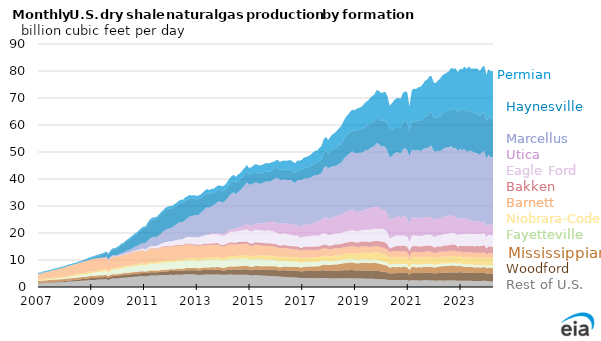
| Category | Rest of U.S. | Woodford | Mississippian | Fayetteville | Niobrara-Codell | Barnett | Bakken | Eagle Ford | Utica | Marcellus | Haynesville | Permian |
|---|---|---|---|---|---|---|---|---|---|---|---|---|
| 2007-01-01 | 1.405 | 0.129 | 0.777 | 0.099 | 0.393 | 1.977 | 0.047 | 0 | 0.001 | 0.002 | 0.082 | 0.333 |
| 2007-02-01 | 1.277 | 0.146 | 0.771 | 0.115 | 0.404 | 2.049 | 0.048 | 0 | 0.001 | 0.002 | 0.081 | 0.348 |
| 2007-03-01 | 1.475 | 0.165 | 0.792 | 0.139 | 0.466 | 2.178 | 0.048 | 0 | 0.001 | 0.003 | 0.08 | 0.356 |
| 2007-04-01 | 1.463 | 0.176 | 0.789 | 0.157 | 0.479 | 2.267 | 0.051 | 0 | 0.001 | 0.003 | 0.076 | 0.356 |
| 2007-05-01 | 1.531 | 0.176 | 0.803 | 0.171 | 0.483 | 2.394 | 0.054 | 0 | 0.001 | 0.004 | 0.079 | 0.358 |
| 2007-06-01 | 1.569 | 0.19 | 0.811 | 0.193 | 0.47 | 2.483 | 0.055 | 0 | 0.001 | 0.004 | 0.077 | 0.363 |
| 2007-07-01 | 1.619 | 0.211 | 0.809 | 0.226 | 0.476 | 2.591 | 0.056 | 0 | 0.001 | 0.005 | 0.077 | 0.371 |
| 2007-08-01 | 1.667 | 0.233 | 0.804 | 0.261 | 0.491 | 2.781 | 0.057 | 0 | 0.001 | 0.006 | 0.077 | 0.379 |
| 2007-09-01 | 1.679 | 0.258 | 0.81 | 0.289 | 0.489 | 2.847 | 0.056 | 0 | 0.001 | 0.007 | 0.079 | 0.379 |
| 2007-10-01 | 1.726 | 0.286 | 0.794 | 0.33 | 0.481 | 2.952 | 0.061 | 0 | 0.001 | 0.008 | 0.079 | 0.376 |
| 2007-11-01 | 1.792 | 0.298 | 0.797 | 0.378 | 0.497 | 3.086 | 0.059 | 0 | 0.001 | 0.009 | 0.084 | 0.375 |
| 2007-12-01 | 1.807 | 0.325 | 0.771 | 0.407 | 0.476 | 3.181 | 0.061 | 0 | 0.001 | 0.011 | 0.086 | 0.369 |
| 2008-01-01 | 1.836 | 0.347 | 0.774 | 0.438 | 0.459 | 3.357 | 0.053 | 0 | 0.001 | 0.015 | 0.088 | 0.37 |
| 2008-02-01 | 1.898 | 0.366 | 0.796 | 0.496 | 0.487 | 3.46 | 0.052 | 0 | 0.001 | 0.018 | 0.084 | 0.381 |
| 2008-03-01 | 1.987 | 0.397 | 0.776 | 0.567 | 0.51 | 3.525 | 0.054 | 0 | 0.001 | 0.02 | 0.086 | 0.388 |
| 2008-04-01 | 2.012 | 0.438 | 0.786 | 0.601 | 0.524 | 3.591 | 0.058 | 0.001 | 0.001 | 0.021 | 0.102 | 0.385 |
| 2008-05-01 | 2.054 | 0.481 | 0.776 | 0.636 | 0.531 | 3.733 | 0.062 | 0.001 | 0.001 | 0.023 | 0.106 | 0.399 |
| 2008-06-01 | 2.122 | 0.519 | 0.772 | 0.685 | 0.536 | 3.767 | 0.063 | 0.001 | 0.001 | 0.026 | 0.108 | 0.392 |
| 2008-07-01 | 2.188 | 0.563 | 0.756 | 0.739 | 0.533 | 3.865 | 0.065 | 0 | 0.001 | 0.027 | 0.122 | 0.415 |
| 2008-08-01 | 2.253 | 0.585 | 0.749 | 0.794 | 0.545 | 4.001 | 0.068 | 0 | 0.001 | 0.028 | 0.132 | 0.419 |
| 2008-09-01 | 2.34 | 0.622 | 0.735 | 0.877 | 0.55 | 4.046 | 0.069 | 0.001 | 0.001 | 0.031 | 0.16 | 0.34 |
| 2008-10-01 | 2.36 | 0.637 | 0.695 | 0.905 | 0.544 | 4.197 | 0.077 | 0.004 | 0.001 | 0.044 | 0.211 | 0.397 |
| 2008-11-01 | 2.397 | 0.681 | 0.713 | 0.956 | 0.56 | 4.267 | 0.08 | 0.005 | 0.001 | 0.061 | 0.267 | 0.429 |
| 2008-12-01 | 2.474 | 0.73 | 0.763 | 1.039 | 0.533 | 4.297 | 0.066 | 0.004 | 0.001 | 0.074 | 0.367 | 0.434 |
| 2009-01-01 | 2.55 | 0.769 | 0.761 | 1.114 | 0.538 | 4.332 | 0.072 | 0.005 | 0.001 | 0.079 | 0.415 | 0.436 |
| 2009-02-01 | 2.592 | 0.803 | 0.766 | 1.135 | 0.556 | 4.43 | 0.075 | 0.008 | 0.001 | 0.099 | 0.497 | 0.445 |
| 2009-03-01 | 2.602 | 0.828 | 0.722 | 1.2 | 0.566 | 4.453 | 0.079 | 0.01 | 0.001 | 0.109 | 0.596 | 0.454 |
| 2009-04-01 | 2.708 | 0.836 | 0.716 | 1.287 | 0.543 | 4.41 | 0.084 | 0.012 | 0.001 | 0.135 | 0.75 | 0.452 |
| 2009-05-01 | 2.766 | 0.834 | 0.73 | 1.349 | 0.553 | 4.328 | 0.086 | 0.018 | 0.001 | 0.147 | 0.892 | 0.464 |
| 2009-06-01 | 2.804 | 0.851 | 0.735 | 1.424 | 0.546 | 4.267 | 0.088 | 0.022 | 0.001 | 0.168 | 1.056 | 0.46 |
| 2009-07-01 | 2.776 | 0.872 | 0.727 | 1.39 | 0.542 | 4.219 | 0.093 | 0.031 | 0.001 | 0.366 | 1.192 | 0.452 |
| 2009-08-01 | 2.973 | 0.841 | 0.721 | 1.597 | 0.549 | 4.151 | 0.096 | 0.04 | 0.001 | 0.366 | 1.398 | 0.456 |
| 2009-09-01 | 2.532 | 0.83 | 0.677 | 1.142 | 0.547 | 4.091 | 0.098 | 0.051 | 0.001 | 0.368 | 1.591 | 0.466 |
| 2009-10-01 | 2.964 | 0.877 | 0.688 | 1.589 | 0.53 | 4.117 | 0.095 | 0.073 | 0.001 | 0.368 | 1.864 | 0.471 |
| 2009-11-01 | 3.149 | 0.906 | 0.694 | 1.777 | 0.538 | 4.102 | 0.098 | 0.106 | 0.001 | 0.376 | 2.131 | 0.478 |
| 2009-12-01 | 3.146 | 0.931 | 0.661 | 1.817 | 0.526 | 4.084 | 0.096 | 0.105 | 0.001 | 0.382 | 2.184 | 0.467 |
| 2010-01-01 | 3.133 | 0.966 | 0.651 | 1.812 | 0.543 | 4.125 | 0.107 | 0.115 | 0.001 | 0.438 | 2.444 | 0.474 |
| 2010-02-01 | 3.226 | 1.013 | 0.658 | 1.839 | 0.551 | 4.161 | 0.114 | 0.123 | 0.001 | 0.522 | 2.657 | 0.496 |
| 2010-03-01 | 3.37 | 1.018 | 0.635 | 1.896 | 0.554 | 4.255 | 0.121 | 0.135 | 0.001 | 0.612 | 3.025 | 0.501 |
| 2010-04-01 | 3.457 | 1.023 | 0.65 | 2 | 0.564 | 4.101 | 0.127 | 0.151 | 0.001 | 0.724 | 3.119 | 0.513 |
| 2010-05-01 | 3.472 | 1.136 | 0.646 | 2.029 | 0.571 | 4.356 | 0.136 | 0.185 | 0.001 | 0.868 | 3.332 | 0.54 |
| 2010-06-01 | 3.523 | 1.086 | 0.655 | 2.072 | 0.561 | 4.327 | 0.143 | 0.226 | 0.001 | 0.962 | 3.679 | 0.546 |
| 2010-07-01 | 3.648 | 1.09 | 0.671 | 2.142 | 0.523 | 4.442 | 0.151 | 0.238 | 0.001 | 1.055 | 3.957 | 0.563 |
| 2010-08-01 | 3.721 | 1.06 | 0.648 | 2.23 | 0.575 | 4.496 | 0.155 | 0.269 | 0.001 | 1.189 | 4.183 | 0.569 |
| 2010-09-01 | 3.784 | 1.091 | 0.651 | 2.261 | 0.577 | 4.646 | 0.167 | 0.309 | 0.001 | 1.357 | 4.384 | 0.573 |
| 2010-10-01 | 3.811 | 1.109 | 0.654 | 2.286 | 0.575 | 4.651 | 0.167 | 0.347 | 0.001 | 1.561 | 4.462 | 0.591 |
| 2010-11-01 | 3.936 | 1.132 | 0.674 | 2.32 | 0.583 | 4.709 | 0.181 | 0.387 | 0.001 | 1.73 | 4.839 | 0.603 |
| 2010-12-01 | 3.96 | 1.202 | 0.647 | 2.382 | 0.588 | 4.731 | 0.173 | 0.506 | 0.001 | 1.871 | 5.179 | 0.607 |
| 2011-01-01 | 3.937 | 1.242 | 0.61 | 2.375 | 0.571 | 4.704 | 0.152 | 0.568 | 0 | 2.158 | 5.446 | 0.619 |
| 2011-02-01 | 3.941 | 1.198 | 0.593 | 2.35 | 0.566 | 4.428 | 0.154 | 0.607 | 0 | 2.439 | 5.634 | 0.559 |
| 2011-03-01 | 4.074 | 1.176 | 0.64 | 2.418 | 0.597 | 4.851 | 0.164 | 0.625 | 0 | 2.724 | 6.122 | 0.661 |
| 2011-04-01 | 4.242 | 1.26 | 0.635 | 2.535 | 0.604 | 4.912 | 0.165 | 0.734 | 0 | 2.962 | 6.388 | 0.674 |
| 2011-05-01 | 4.263 | 1.209 | 0.638 | 2.538 | 0.589 | 4.975 | 0.169 | 0.79 | 0 | 3.194 | 6.603 | 0.706 |
| 2011-06-01 | 4.261 | 1.171 | 0.627 | 2.542 | 0.615 | 4.907 | 0.185 | 0.833 | 0.008 | 3.425 | 6.522 | 0.734 |
| 2011-07-01 | 4.269 | 1.171 | 0.651 | 2.573 | 0.62 | 4.889 | 0.206 | 0.922 | 0.009 | 3.222 | 6.688 | 0.775 |
| 2011-08-01 | 4.293 | 1.221 | 0.637 | 2.572 | 0.634 | 4.934 | 0.224 | 1.043 | 0.012 | 3.518 | 6.952 | 0.789 |
| 2011-09-01 | 4.414 | 1.229 | 0.64 | 2.669 | 0.625 | 5.061 | 0.233 | 1.186 | 0.018 | 3.82 | 7.095 | 0.802 |
| 2011-10-01 | 4.427 | 1.239 | 0.664 | 2.704 | 0.647 | 5.1 | 0.248 | 1.261 | 0.019 | 4.211 | 7.149 | 0.823 |
| 2011-11-01 | 4.459 | 1.305 | 0.648 | 2.69 | 0.659 | 5.193 | 0.261 | 1.404 | 0.019 | 4.557 | 7.342 | 0.847 |
| 2011-12-01 | 4.46 | 1.322 | 0.664 | 2.711 | 0.655 | 5.115 | 0.272 | 1.512 | 0.019 | 4.854 | 7.281 | 0.849 |
| 2012-01-01 | 4.497 | 1.423 | 0.67 | 2.73 | 0.662 | 5.055 | 0.283 | 1.613 | 0.013 | 4.795 | 7.389 | 0.885 |
| 2012-02-01 | 4.503 | 1.385 | 0.654 | 2.706 | 0.682 | 5.003 | 0.295 | 1.654 | 0.017 | 5.152 | 6.998 | 0.932 |
| 2012-03-01 | 4.435 | 1.459 | 0.651 | 2.743 | 0.704 | 5.142 | 0.309 | 1.74 | 0.018 | 5.509 | 6.956 | 0.978 |
| 2012-04-01 | 4.591 | 1.435 | 0.701 | 2.778 | 0.636 | 5.09 | 0.323 | 1.767 | 0.022 | 5.887 | 6.914 | 1.028 |
| 2012-05-01 | 4.559 | 1.513 | 0.718 | 2.756 | 0.704 | 5.095 | 0.344 | 1.907 | 0.022 | 6.264 | 6.984 | 1.037 |
| 2012-06-01 | 4.557 | 1.464 | 0.734 | 2.758 | 0.649 | 5.042 | 0.357 | 1.998 | 0.035 | 6.47 | 7.184 | 1.068 |
| 2012-07-01 | 4.579 | 1.381 | 0.755 | 2.754 | 0.651 | 5.151 | 0.37 | 2.091 | 0.044 | 6.3 | 7.144 | 1.137 |
| 2012-08-01 | 4.702 | 1.468 | 0.796 | 2.839 | 0.655 | 5.114 | 0.395 | 2.238 | 0.054 | 6.635 | 7.135 | 1.153 |
| 2012-09-01 | 4.679 | 1.567 | 0.799 | 2.868 | 0.714 | 5.098 | 0.414 | 2.334 | 0.062 | 6.932 | 6.969 | 1.194 |
| 2012-10-01 | 4.748 | 1.466 | 0.8 | 2.877 | 0.768 | 5.034 | 0.416 | 2.462 | 0.062 | 7.511 | 6.726 | 1.235 |
| 2012-11-01 | 4.717 | 1.447 | 0.851 | 2.899 | 0.779 | 4.674 | 0.408 | 2.556 | 0.074 | 7.78 | 6.406 | 1.275 |
| 2012-12-01 | 4.648 | 1.569 | 0.831 | 2.888 | 0.782 | 4.74 | 0.429 | 2.565 | 0.086 | 8.055 | 6.191 | 1.264 |
| 2013-01-01 | 4.561 | 1.643 | 0.873 | 2.833 | 0.765 | 4.764 | 0.423 | 2.594 | 0.084 | 8.008 | 5.941 | 1.248 |
| 2013-02-01 | 4.488 | 1.569 | 0.83 | 2.767 | 0.786 | 4.748 | 0.449 | 2.744 | 0.104 | 8.222 | 5.815 | 1.321 |
| 2013-03-01 | 4.484 | 1.65 | 0.846 | 2.749 | 0.794 | 4.73 | 0.455 | 2.898 | 0.114 | 8.684 | 5.553 | 1.349 |
| 2013-04-01 | 4.539 | 1.708 | 0.923 | 2.78 | 0.803 | 4.654 | 0.463 | 2.976 | 0.154 | 9.112 | 5.441 | 1.457 |
| 2013-05-01 | 4.602 | 1.704 | 0.954 | 2.816 | 0.795 | 4.666 | 0.485 | 3.096 | 0.168 | 9.712 | 5.308 | 1.5 |
| 2013-06-01 | 4.61 | 1.655 | 0.937 | 2.82 | 0.788 | 4.65 | 0.506 | 3.243 | 0.209 | 10.145 | 5.158 | 1.558 |
| 2013-07-01 | 4.577 | 1.69 | 0.956 | 2.807 | 0.809 | 4.648 | 0.535 | 3.288 | 0.34 | 9.7 | 4.968 | 1.595 |
| 2013-08-01 | 4.627 | 1.743 | 1.014 | 2.834 | 0.842 | 4.66 | 0.553 | 3.275 | 0.384 | 10.081 | 4.744 | 1.633 |
| 2013-09-01 | 4.623 | 1.721 | 0.912 | 2.833 | 0.814 | 4.615 | 0.583 | 3.339 | 0.422 | 10.438 | 4.43 | 1.708 |
| 2013-10-01 | 4.665 | 1.728 | 0.985 | 2.867 | 0.874 | 4.604 | 0.582 | 3.293 | 0.431 | 11.009 | 4.298 | 1.722 |
| 2013-11-01 | 4.669 | 1.698 | 1.006 | 2.866 | 0.891 | 4.536 | 0.596 | 3.275 | 0.472 | 11.683 | 4.293 | 1.676 |
| 2013-12-01 | 4.578 | 1.701 | 0.961 | 2.79 | 0.839 | 4.236 | 0.559 | 3.464 | 0.546 | 11.968 | 4.228 | 1.67 |
| 2014-01-01 | 4.526 | 1.592 | 0.986 | 2.77 | 0.835 | 4.344 | 0.582 | 3.387 | 0.682 | 11.583 | 4.141 | 1.807 |
| 2014-02-01 | 4.537 | 1.601 | 0.972 | 2.805 | 0.869 | 4.329 | 0.608 | 3.478 | 0.711 | 11.893 | 4.101 | 1.873 |
| 2014-03-01 | 4.569 | 1.729 | 1.054 | 2.82 | 0.927 | 4.376 | 0.623 | 3.603 | 0.778 | 12.225 | 4.091 | 1.996 |
| 2014-04-01 | 4.631 | 1.881 | 1.115 | 2.822 | 0.98 | 4.411 | 0.639 | 3.795 | 0.858 | 12.652 | 4.137 | 2.117 |
| 2014-05-01 | 4.629 | 1.878 | 1.118 | 2.831 | 1.032 | 4.381 | 0.679 | 3.943 | 0.908 | 13.177 | 4.226 | 2.183 |
| 2014-06-01 | 4.548 | 1.894 | 1.127 | 2.777 | 1.038 | 4.327 | 0.715 | 4.054 | 1.014 | 13.617 | 4.168 | 2.252 |
| 2014-07-01 | 4.563 | 1.882 | 1.159 | 2.791 | 1.048 | 4.254 | 0.744 | 4.094 | 1.251 | 12.594 | 4.08 | 2.33 |
| 2014-08-01 | 4.565 | 1.916 | 1.202 | 2.793 | 1.146 | 4.239 | 0.774 | 4.137 | 1.386 | 12.979 | 4.084 | 2.443 |
| 2014-09-01 | 4.56 | 1.929 | 1.229 | 2.782 | 1.129 | 4.224 | 0.818 | 4.151 | 1.519 | 13.517 | 4.029 | 2.348 |
| 2014-10-01 | 4.553 | 1.942 | 1.268 | 2.763 | 1.185 | 4.208 | 0.823 | 4.232 | 1.668 | 14.086 | 3.982 | 2.487 |
| 2014-11-01 | 4.59 | 2.014 | 1.281 | 2.806 | 1.168 | 4.153 | 0.825 | 4.332 | 1.773 | 14.755 | 3.879 | 2.531 |
| 2014-12-01 | 4.555 | 1.988 | 1.298 | 2.746 | 1.23 | 4.171 | 0.87 | 4.623 | 1.919 | 15.352 | 3.903 | 2.569 |
| 2015-01-01 | 4.394 | 1.972 | 1.288 | 2.638 | 1.237 | 3.917 | 0.89 | 4.46 | 2.031 | 15.088 | 3.859 | 2.295 |
| 2015-02-01 | 4.226 | 1.958 | 1.324 | 2.528 | 1.306 | 3.862 | 0.895 | 4.569 | 2.132 | 15.123 | 3.922 | 2.501 |
| 2015-03-01 | 4.365 | 2.034 | 1.153 | 2.606 | 1.349 | 3.813 | 0.924 | 4.6 | 2.16 | 15.358 | 3.951 | 2.655 |
| 2015-04-01 | 4.422 | 2.109 | 1.363 | 2.647 | 1.397 | 3.814 | 0.929 | 4.579 | 2.336 | 15.162 | 3.911 | 2.855 |
| 2015-05-01 | 4.386 | 2.02 | 1.37 | 2.626 | 1.403 | 3.738 | 0.981 | 4.565 | 2.533 | 14.746 | 3.892 | 2.97 |
| 2015-06-01 | 4.287 | 2.045 | 1.361 | 2.543 | 1.464 | 3.686 | 1.003 | 4.563 | 2.643 | 14.571 | 3.779 | 3.029 |
| 2015-07-01 | 4.225 | 2.156 | 1.346 | 2.494 | 1.421 | 3.644 | 1.01 | 4.656 | 2.661 | 14.876 | 3.774 | 2.983 |
| 2015-08-01 | 4.161 | 2.158 | 1.368 | 2.443 | 1.517 | 3.604 | 1.001 | 4.594 | 2.81 | 15.213 | 3.721 | 3.114 |
| 2015-09-01 | 4.147 | 2.177 | 1.361 | 2.445 | 1.516 | 3.567 | 0.978 | 4.714 | 2.913 | 15.303 | 3.661 | 3.146 |
| 2015-10-01 | 4.111 | 2.255 | 1.385 | 2.405 | 1.552 | 3.532 | 1.012 | 4.697 | 3.176 | 14.911 | 3.627 | 3.108 |
| 2015-11-01 | 4.097 | 2.259 | 1.34 | 2.365 | 1.554 | 3.5 | 1.026 | 4.566 | 3.404 | 15.133 | 3.725 | 3.129 |
| 2015-12-01 | 4.072 | 2.353 | 1.304 | 2.324 | 1.534 | 3.45 | 1.023 | 4.615 | 3.543 | 15.586 | 3.651 | 2.851 |
| 2016-01-01 | 3.962 | 2.427 | 1.332 | 2.243 | 1.584 | 3.294 | 1.075 | 4.363 | 3.663 | 16.264 | 3.733 | 2.843 |
| 2016-02-01 | 3.927 | 2.225 | 1.311 | 2.214 | 1.593 | 3.308 | 1.11 | 4.303 | 3.819 | 16.64 | 3.712 | 3.026 |
| 2016-03-01 | 3.85 | 2.185 | 1.221 | 2.148 | 1.585 | 3.26 | 1.125 | 4.265 | 3.901 | 16.183 | 3.496 | 3.138 |
| 2016-04-01 | 3.792 | 2.417 | 1.237 | 2.109 | 1.635 | 3.206 | 1.067 | 4.272 | 3.765 | 16.165 | 3.733 | 3.226 |
| 2016-05-01 | 3.745 | 2.504 | 1.353 | 2.066 | 1.655 | 3.201 | 1.078 | 4.285 | 3.82 | 16.115 | 3.758 | 3.283 |
| 2016-06-01 | 3.683 | 2.464 | 1.4 | 1.996 | 1.594 | 3.136 | 1.088 | 4.264 | 3.92 | 16.061 | 3.737 | 3.366 |
| 2016-07-01 | 3.637 | 2.516 | 1.367 | 1.954 | 1.602 | 3.099 | 1.11 | 4.176 | 3.851 | 16.297 | 3.831 | 3.468 |
| 2016-08-01 | 3.626 | 2.528 | 1.38 | 1.918 | 1.65 | 3.059 | 1.069 | 4.078 | 4.114 | 16.276 | 3.725 | 3.579 |
| 2016-09-01 | 3.573 | 2.487 | 1.392 | 1.894 | 1.635 | 3.007 | 1.052 | 3.967 | 4.196 | 15.835 | 3.732 | 3.601 |
| 2016-10-01 | 3.518 | 2.467 | 1.442 | 1.88 | 1.673 | 2.99 | 1.124 | 3.926 | 3.961 | 15.487 | 3.704 | 3.653 |
| 2016-11-01 | 3.465 | 2.494 | 1.485 | 1.864 | 1.688 | 2.955 | 1.154 | 3.866 | 4.073 | 16.5 | 3.704 | 3.609 |
| 2016-12-01 | 3.359 | 2.487 | 1.461 | 1.805 | 1.65 | 2.888 | 1.007 | 3.756 | 4.241 | 16.865 | 3.697 | 3.532 |
| 2017-01-01 | 3.292 | 2.463 | 1.442 | 1.762 | 1.634 | 2.881 | 1.022 | 3.767 | 4.283 | 17.105 | 3.781 | 3.672 |
| 2017-02-01 | 3.32 | 2.598 | 1.566 | 1.773 | 1.652 | 2.911 | 1.122 | 3.798 | 4.351 | 17.074 | 3.853 | 3.918 |
| 2017-03-01 | 3.279 | 2.621 | 1.573 | 1.734 | 1.666 | 2.867 | 1.136 | 3.745 | 4.408 | 17.119 | 3.991 | 4.023 |
| 2017-04-01 | 3.29 | 2.622 | 1.634 | 1.725 | 1.661 | 2.859 | 1.207 | 3.806 | 4.356 | 17.196 | 4.003 | 4.105 |
| 2017-05-01 | 3.291 | 2.626 | 1.633 | 1.706 | 1.627 | 2.824 | 1.215 | 3.881 | 4.439 | 17.255 | 4.144 | 4.33 |
| 2017-06-01 | 3.289 | 2.622 | 1.717 | 1.68 | 1.643 | 2.805 | 1.213 | 3.993 | 4.712 | 17.3 | 4.345 | 4.423 |
| 2017-07-01 | 3.238 | 2.637 | 1.738 | 1.637 | 1.683 | 2.767 | 1.246 | 4.122 | 5.041 | 17.305 | 4.393 | 4.584 |
| 2017-08-01 | 3.255 | 2.632 | 1.839 | 1.625 | 1.742 | 2.726 | 1.28 | 3.852 | 5.223 | 17.196 | 4.592 | 4.62 |
| 2017-09-01 | 3.349 | 2.617 | 1.755 | 1.598 | 1.766 | 2.701 | 1.276 | 3.995 | 5.383 | 17.363 | 4.929 | 4.733 |
| 2017-10-01 | 3.322 | 2.883 | 1.864 | 1.581 | 1.749 | 2.699 | 1.358 | 4.156 | 5.375 | 17.099 | 5.132 | 5.045 |
| 2017-11-01 | 3.346 | 2.887 | 2.018 | 1.566 | 1.797 | 2.682 | 1.381 | 4.228 | 5.724 | 18.478 | 5.505 | 5.17 |
| 2017-12-01 | 3.314 | 2.82 | 2.111 | 1.525 | 1.866 | 2.699 | 1.376 | 4.163 | 6.004 | 18.953 | 5.601 | 5.194 |
| 2018-01-01 | 3.203 | 2.755 | 2.197 | 1.414 | 1.855 | 2.542 | 1.333 | 3.95 | 6.035 | 18.584 | 5.581 | 4.969 |
| 2018-02-01 | 3.18 | 2.767 | 2.224 | 1.411 | 1.841 | 2.588 | 1.356 | 3.952 | 6.243 | 18.864 | 5.882 | 5.362 |
| 2018-03-01 | 3.188 | 2.798 | 2.256 | 1.398 | 1.867 | 2.585 | 1.363 | 4.041 | 6.319 | 18.822 | 6.197 | 5.681 |
| 2018-04-01 | 3.224 | 2.868 | 2.302 | 1.463 | 1.964 | 2.565 | 1.445 | 4.024 | 6.103 | 18.817 | 6.386 | 5.939 |
| 2018-05-01 | 3.184 | 2.783 | 2.384 | 1.419 | 1.972 | 2.58 | 1.496 | 4.075 | 6.53 | 18.644 | 6.778 | 6.05 |
| 2018-06-01 | 3.216 | 2.845 | 2.466 | 1.4 | 1.856 | 2.572 | 1.484 | 4.12 | 6.743 | 18.87 | 6.951 | 6.288 |
| 2018-07-01 | 3.235 | 2.884 | 2.528 | 1.372 | 1.933 | 2.511 | 1.548 | 4.09 | 6.598 | 19.414 | 7.072 | 6.562 |
| 2018-08-01 | 3.286 | 2.88 | 2.613 | 1.377 | 2.024 | 2.504 | 1.573 | 4.148 | 6.96 | 19.893 | 7.244 | 6.9 |
| 2018-09-01 | 3.256 | 2.931 | 2.685 | 1.368 | 2.076 | 2.479 | 1.621 | 4.132 | 7.311 | 20.479 | 7.403 | 7.102 |
| 2018-10-01 | 3.243 | 2.934 | 2.827 | 1.367 | 2.094 | 2.48 | 1.652 | 4.113 | 7.316 | 20.868 | 7.69 | 7.23 |
| 2018-11-01 | 3.265 | 3 | 2.8 | 1.361 | 2.205 | 2.455 | 1.628 | 4.169 | 7.577 | 21.295 | 7.737 | 7.364 |
| 2018-12-01 | 3.21 | 3.052 | 2.815 | 1.343 | 2.264 | 2.451 | 1.712 | 4.215 | 7.797 | 21.413 | 7.741 | 7.681 |
| 2019-01-01 | 3.162 | 2.972 | 2.733 | 1.323 | 2.311 | 2.457 | 1.729 | 4.178 | 7.043 | 21.69 | 8.06 | 7.785 |
| 2019-02-01 | 3.137 | 2.979 | 2.677 | 1.3 | 2.307 | 2.441 | 1.671 | 4.131 | 7.262 | 21.701 | 8.383 | 8.034 |
| 2019-03-01 | 3.137 | 2.951 | 2.654 | 1.286 | 2.278 | 2.413 | 1.799 | 4.136 | 7.35 | 21.737 | 8.429 | 8.165 |
| 2019-04-01 | 3.156 | 2.988 | 2.832 | 1.28 | 2.386 | 2.391 | 1.817 | 4.232 | 6.903 | 21.733 | 8.563 | 8.401 |
| 2019-05-01 | 3.108 | 3.033 | 2.875 | 1.252 | 2.371 | 2.366 | 1.809 | 4.296 | 7.286 | 21.577 | 8.752 | 8.762 |
| 2019-06-01 | 3.094 | 3.01 | 2.895 | 1.24 | 2.445 | 2.344 | 1.855 | 4.357 | 7.56 | 21.847 | 8.855 | 8.912 |
| 2019-07-01 | 3.046 | 2.957 | 2.96 | 1.228 | 2.412 | 2.319 | 1.893 | 4.405 | 7.473 | 22.035 | 9.13 | 9.13 |
| 2019-08-01 | 3.017 | 2.863 | 2.906 | 1.218 | 2.455 | 2.299 | 1.939 | 4.463 | 7.939 | 22.14 | 9.08 | 9.558 |
| 2019-09-01 | 3.039 | 3.028 | 2.968 | 1.207 | 2.463 | 2.28 | 1.9 | 4.529 | 8.224 | 22.259 | 9.071 | 9.804 |
| 2019-10-01 | 2.987 | 3.02 | 2.926 | 1.203 | 2.674 | 2.259 | 1.99 | 4.524 | 7.892 | 22.663 | 9.231 | 9.868 |
| 2019-11-01 | 2.985 | 3.035 | 2.813 | 1.206 | 2.814 | 2.234 | 2.031 | 4.48 | 8.229 | 23.483 | 9.391 | 10.139 |
| 2019-12-01 | 2.932 | 2.992 | 2.789 | 1.198 | 2.858 | 2.228 | 1.987 | 4.504 | 8.291 | 23.261 | 9.472 | 10.255 |
| 2020-01-01 | 2.822 | 2.898 | 2.761 | 1.18 | 2.802 | 2.295 | 2.187 | 4.674 | 7.024 | 23.354 | 9.603 | 10.243 |
| 2020-02-01 | 2.858 | 2.803 | 2.643 | 1.162 | 2.795 | 2.256 | 2.253 | 4.618 | 7.228 | 23.579 | 9.606 | 10.243 |
| 2020-03-01 | 2.782 | 2.749 | 2.566 | 1.135 | 2.756 | 2.236 | 2.276 | 4.602 | 7.337 | 23.422 | 9.783 | 10.679 |
| 2020-04-01 | 2.694 | 2.656 | 2.394 | 1.145 | 2.767 | 2.19 | 1.977 | 4.418 | 6.695 | 23.514 | 9.784 | 10.297 |
| 2020-05-01 | 2.514 | 2.419 | 2.139 | 1.127 | 2.53 | 2.156 | 1.4 | 3.675 | 6.935 | 23.162 | 9.993 | 9.123 |
| 2020-06-01 | 2.594 | 2.534 | 2.255 | 1.115 | 2.529 | 2.142 | 1.429 | 3.729 | 7.095 | 22.983 | 9.708 | 9.951 |
| 2020-07-01 | 2.594 | 2.522 | 2.291 | 1.11 | 2.618 | 2.12 | 1.669 | 3.819 | 6.795 | 23.88 | 9.327 | 10.423 |
| 2020-08-01 | 2.604 | 2.494 | 2.218 | 1.115 | 2.697 | 2.1 | 1.913 | 3.891 | 6.803 | 24.116 | 9.29 | 10.613 |
| 2020-09-01 | 2.621 | 2.59 | 2.245 | 1.107 | 2.67 | 2.097 | 2.037 | 3.843 | 7.119 | 23.496 | 9.48 | 10.687 |
| 2020-10-01 | 2.606 | 2.534 | 2.126 | 1.112 | 2.603 | 2.073 | 2.094 | 3.751 | 6.736 | 23.754 | 9.567 | 10.831 |
| 2020-11-01 | 2.631 | 2.672 | 2.259 | 1.102 | 2.614 | 2.068 | 2.095 | 3.715 | 6.968 | 24.785 | 10.123 | 10.824 |
| 2020-12-01 | 2.579 | 2.641 | 2.185 | 1.088 | 2.545 | 2.043 | 2.094 | 3.677 | 7.276 | 25.332 | 10.362 | 10.66 |
| 2021-01-01 | 2.544 | 2.615 | 2.171 | 1.085 | 2.502 | 2.001 | 2.096 | 3.644 | 6.655 | 25.366 | 10.248 | 11.194 |
| 2021-02-01 | 2.286 | 2.196 | 1.771 | 0.904 | 2.466 | 1.729 | 1.99 | 3.229 | 6.892 | 25.01 | 9.175 | 9.114 |
| 2021-03-01 | 2.534 | 2.719 | 2.144 | 1.098 | 2.466 | 1.951 | 2.109 | 3.842 | 7.058 | 24.884 | 10.557 | 11.311 |
| 2021-04-01 | 2.512 | 2.778 | 2.138 | 1.077 | 2.606 | 1.972 | 2.158 | 3.941 | 6.539 | 24.909 | 10.683 | 12.163 |
| 2021-05-01 | 2.365 | 2.722 | 2.143 | 1.064 | 2.662 | 1.949 | 2.197 | 3.866 | 6.755 | 24.843 | 10.689 | 12.07 |
| 2021-06-01 | 2.479 | 2.724 | 2.109 | 1.051 | 2.618 | 1.94 | 2.202 | 3.825 | 6.927 | 24.944 | 10.961 | 12.155 |
| 2021-07-01 | 2.312 | 2.796 | 2.147 | 1.048 | 2.636 | 1.958 | 2.119 | 3.897 | 6.467 | 24.841 | 11.424 | 12.536 |
| 2021-08-01 | 2.466 | 2.758 | 2.135 | 1.04 | 2.607 | 1.935 | 2.18 | 3.828 | 6.548 | 25.526 | 11.348 | 12.693 |
| 2021-09-01 | 2.484 | 2.774 | 2.233 | 1.038 | 2.601 | 1.952 | 2.224 | 3.998 | 6.591 | 25.472 | 11.723 | 13.26 |
| 2021-10-01 | 2.477 | 2.745 | 2.287 | 1.034 | 2.648 | 1.967 | 2.206 | 3.966 | 6.496 | 25.506 | 11.913 | 13.511 |
| 2021-11-01 | 2.451 | 2.821 | 2.274 | 1.026 | 2.619 | 1.959 | 2.27 | 3.949 | 6.67 | 25.985 | 12.359 | 13.606 |
| 2021-12-01 | 2.43 | 2.753 | 2.231 | 1.016 | 2.612 | 1.94 | 2.229 | 3.907 | 6.755 | 26.469 | 12.547 | 13.301 |
| 2022-01-01 | 2.387 | 2.699 | 2.169 | 0.989 | 2.489 | 1.891 | 2.087 | 3.832 | 6.284 | 25.646 | 12.432 | 12.874 |
| 2022-02-01 | 2.339 | 2.686 | 2.236 | 0.979 | 2.52 | 1.843 | 2.111 | 3.913 | 6.475 | 24.945 | 12.481 | 13.029 |
| 2022-03-01 | 2.398 | 2.775 | 2.311 | 0.992 | 2.58 | 1.88 | 2.214 | 3.989 | 6.555 | 24.794 | 12.283 | 13.756 |
| 2022-04-01 | 2.371 | 2.937 | 2.347 | 0.989 | 2.58 | 1.892 | 1.804 | 4.163 | 6.329 | 24.829 | 12.808 | 14.209 |
| 2022-05-01 | 2.38 | 2.919 | 2.397 | 0.977 | 2.535 | 1.905 | 2.049 | 4.184 | 6.444 | 25.165 | 13.245 | 14.262 |
| 2022-06-01 | 2.347 | 2.919 | 2.468 | 0.967 | 2.513 | 1.881 | 2.249 | 4.33 | 6.663 | 25.169 | 13.227 | 14.176 |
| 2022-07-01 | 2.378 | 2.906 | 2.479 | 0.959 | 2.545 | 1.867 | 2.282 | 4.254 | 6.432 | 25.579 | 13.239 | 14.463 |
| 2022-08-01 | 2.363 | 2.948 | 2.441 | 0.962 | 2.574 | 1.927 | 2.269 | 4.311 | 6.643 | 25.364 | 13.468 | 14.689 |
| 2022-09-01 | 2.367 | 3.075 | 2.548 | 0.961 | 2.584 | 1.895 | 2.337 | 4.313 | 6.693 | 25.425 | 13.896 | 15.071 |
| 2022-10-01 | 2.417 | 2.93 | 2.572 | 0.954 | 2.583 | 1.914 | 2.319 | 4.321 | 6.074 | 25.293 | 14.292 | 15.118 |
| 2022-11-01 | 2.378 | 3.079 | 2.451 | 0.943 | 2.593 | 1.952 | 2.24 | 4.277 | 6.269 | 25.383 | 14.457 | 15.008 |
| 2022-12-01 | 2.303 | 3.012 | 2.364 | 0.898 | 2.441 | 1.871 | 1.947 | 4.247 | 6.367 | 24.849 | 14.342 | 14.909 |
| 2023-01-01 | 2.346 | 3.204 | 2.392 | 0.938 | 2.552 | 1.868 | 2.103 | 4.232 | 5.857 | 25.744 | 14.386 | 15.215 |
| 2023-02-01 | 2.294 | 3.013 | 2.284 | 0.928 | 2.539 | 1.826 | 2.25 | 4.317 | 5.841 | 25.378 | 14.783 | 15.17 |
| 2023-03-01 | 2.303 | 2.977 | 2.25 | 0.926 | 2.567 | 1.88 | 2.255 | 4.572 | 5.842 | 25.592 | 14.571 | 15.924 |
| 2023-04-01 | 2.299 | 2.986 | 2.206 | 0.913 | 2.584 | 1.876 | 2.307 | 4.514 | 5.222 | 25.173 | 14.637 | 16.074 |
| 2023-05-01 | 2.288 | 2.973 | 2.222 | 0.906 | 2.6 | 1.852 | 2.339 | 4.582 | 5.228 | 25.39 | 15.213 | 16.058 |
| 2023-06-01 | 2.271 | 2.983 | 2.113 | 0.897 | 2.638 | 1.836 | 2.397 | 4.498 | 5.17 | 25.667 | 14.506 | 15.866 |
| 2023-07-01 | 2.257 | 2.961 | 2.14 | 0.89 | 2.654 | 1.814 | 2.44 | 4.515 | 4.799 | 25.532 | 14.652 | 16.235 |
| 2023-08-01 | 2.256 | 2.873 | 2.084 | 0.885 | 2.711 | 1.779 | 2.461 | 4.421 | 4.777 | 25.462 | 14.63 | 16.556 |
| 2023-09-01 | 2.248 | 2.925 | 2.17 | 0.884 | 2.696 | 1.79 | 2.554 | 4.552 | 4.718 | 25.048 | 14.547 | 16.727 |
| 2023-10-01 | 2.214 | 2.924 | 2.057 | 0.878 | 2.729 | 1.771 | 2.527 | 4.483 | 4.234 | 25.039 | 14.413 | 16.712 |
| 2023-11-01 | 2.286 | 2.875 | 2.088 | 0.872 | 2.781 | 1.778 | 2.569 | 4.497 | 4.26 | 26.037 | 14.242 | 17.027 |
| 2023-12-01 | 2.332 | 2.969 | 2.166 | 0.862 | 2.812 | 1.783 | 2.611 | 4.422 | 4.242 | 26.19 | 14.281 | 17.33 |
| 2024-01-01 | 2.199 | 2.73 | 2.01 | 0.774 | 2.633 | 1.669 | 2.22 | 4.214 | 3.859 | 25.19 | 13.852 | 17.34 |
| 2024-02-01 | 2.169 | 2.875 | 2.162 | 0.85 | 2.824 | 1.764 | 2.488 | 4.213 | 3.975 | 25.694 | 14.171 | 17.527 |
| 2024-03-01 | 2.05 | 2.875 | 2.16 | 0.849 | 2.795 | 1.755 | 2.489 | 4.212 | 3.955 | 24.974 | 14.122 | 17.591 |
| 2024-04-01 | 2.037 | 2.875 | 2.158 | 0.851 | 2.806 | 1.744 | 2.507 | 4.211 | 3.938 | 24.969 | 14.215 | 17.729 |
| 2024-05-01 | 2.026 | 2.875 | 2.156 | 0.842 | 2.817 | 1.733 | 2.517 | 4.21 | 3.922 | 24.964 | 14.328 | 17.834 |
| 2024-06-01 | 0 | 0 | 0 | 0 | 0 | 0 | 0 | 0 | 0 | 0 | 0 | 0 |
| 2024-07-01 | 0 | 0 | 0 | 0 | 0 | 0 | 0 | 0 | 0 | 0 | 0 | 0 |
| 2024-08-01 | 0 | 0 | 0 | 0 | 0 | 0 | 0 | 0 | 0 | 0 | 0 | 0 |
| 2024-09-01 | 0 | 0 | 0 | 0 | 0 | 0 | 0 | 0 | 0 | 0 | 0 | 0 |
| 2024-10-01 | 0 | 0 | 0 | 0 | 0 | 0 | 0 | 0 | 0 | 0 | 0 | 0 |
| 2024-11-01 | 0 | 0 | 0 | 0 | 0 | 0 | 0 | 0 | 0 | 0 | 0 | 0 |
| 2024-12-01 | 0 | 0 | 0 | 0 | 0 | 0 | 0 | 0 | 0 | 0 | 0 | 0 |